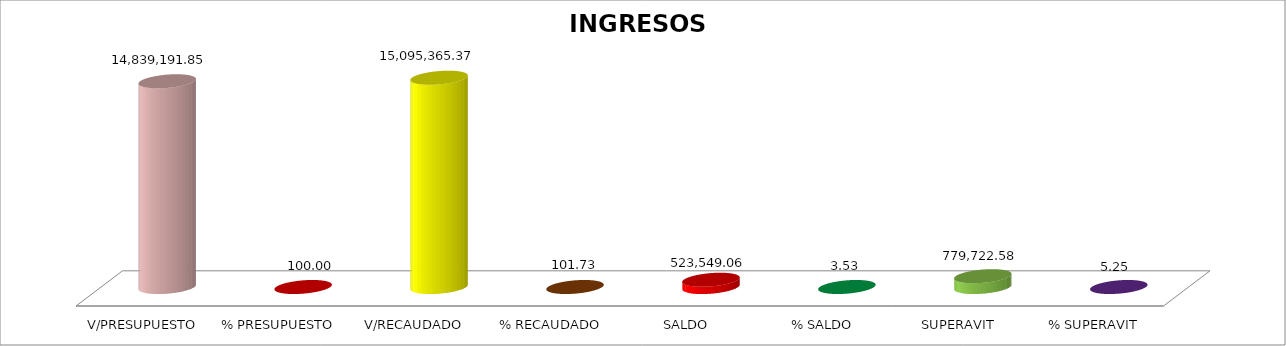
| Category | INGRESOS  CORRIENTES |
|---|---|
| V/PRESUPUESTO | 14839191.85 |
| % PRESUPUESTO | 100 |
| V/RECAUDADO | 15095365.37 |
| % RECAUDADO | 101.726 |
| SALDO | 523549.06 |
| % SALDO | 3.528 |
| SUPERAVIT | 779722.58 |
| % SUPERAVIT | 5.254 |